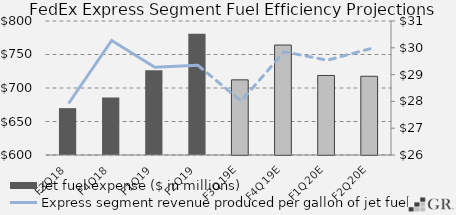
| Category | Jet fuel expense ($ in millions) |
|---|---|
|  F3Q18  | 669.95 |
|  F4Q18  | 685.794 |
|  F1Q19  | 726.404 |
|  F2Q19  | 781.141 |
|  F3Q19E  | 712.15 |
|  F4Q19E  | 764.124 |
|  F1Q20E  | 718.706 |
|  F2Q20E  | 717.496 |